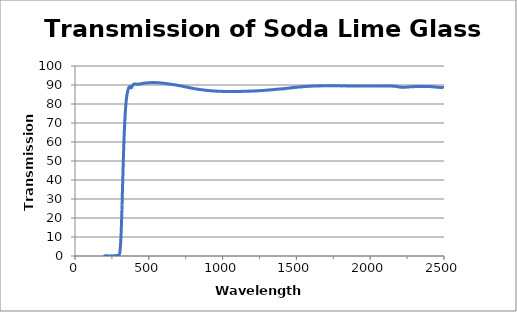
| Category | Wavelength (nm) |
|---|---|
| 2500.0 | 88.353 |
| 2499.0 | 88.603 |
| 2498.0 | 88.601 |
| 2497.0 | 88.594 |
| 2496.0 | 88.602 |
| 2495.0 | 88.6 |
| 2494.0 | 88.609 |
| 2493.0 | 88.615 |
| 2492.0 | 88.618 |
| 2491.0 | 88.608 |
| 2490.0 | 88.62 |
| 2489.0 | 88.626 |
| 2488.0 | 88.641 |
| 2487.0 | 88.64 |
| 2486.0 | 88.636 |
| 2485.0 | 88.64 |
| 2484.0 | 88.651 |
| 2483.0 | 88.662 |
| 2482.0 | 88.662 |
| 2481.0 | 88.669 |
| 2480.0 | 88.673 |
| 2479.0 | 88.682 |
| 2478.0 | 88.686 |
| 2477.0 | 88.693 |
| 2476.0 | 88.701 |
| 2475.0 | 88.702 |
| 2474.0 | 88.704 |
| 2473.0 | 88.718 |
| 2472.0 | 88.721 |
| 2471.0 | 88.729 |
| 2470.0 | 88.737 |
| 2469.0 | 88.743 |
| 2468.0 | 88.75 |
| 2467.0 | 88.754 |
| 2466.0 | 88.769 |
| 2465.0 | 88.775 |
| 2464.0 | 88.779 |
| 2463.0 | 88.773 |
| 2462.0 | 88.78 |
| 2461.0 | 88.8 |
| 2460.0 | 88.797 |
| 2459.0 | 88.797 |
| 2458.0 | 88.8 |
| 2457.0 | 88.791 |
| 2456.0 | 88.814 |
| 2455.0 | 88.825 |
| 2454.0 | 88.813 |
| 2453.0 | 88.838 |
| 2452.0 | 88.867 |
| 2451.0 | 88.877 |
| 2450.0 | 88.859 |
| 2449.0 | 88.879 |
| 2448.0 | 88.883 |
| 2447.0 | 88.892 |
| 2446.0 | 88.896 |
| 2445.0 | 88.91 |
| 2444.0 | 88.904 |
| 2443.0 | 88.913 |
| 2442.0 | 88.921 |
| 2441.0 | 88.931 |
| 2440.0 | 88.936 |
| 2439.0 | 88.947 |
| 2438.0 | 88.97 |
| 2437.0 | 88.963 |
| 2436.0 | 88.978 |
| 2435.0 | 88.982 |
| 2434.0 | 88.986 |
| 2433.0 | 88.985 |
| 2432.0 | 89.004 |
| 2431.0 | 89.008 |
| 2430.0 | 89.011 |
| 2429.0 | 89.038 |
| 2428.0 | 89.028 |
| 2427.0 | 89.035 |
| 2426.0 | 89.05 |
| 2425.0 | 89.043 |
| 2424.0 | 89.013 |
| 2423.0 | 89.048 |
| 2422.0 | 89.053 |
| 2421.0 | 89.077 |
| 2420.0 | 89.086 |
| 2419.0 | 89.094 |
| 2418.0 | 89.093 |
| 2417.0 | 89.095 |
| 2416.0 | 89.104 |
| 2415.0 | 89.088 |
| 2414.0 | 89.118 |
| 2413.0 | 89.128 |
| 2412.0 | 89.14 |
| 2411.0 | 89.134 |
| 2410.0 | 89.148 |
| 2409.0 | 89.146 |
| 2408.0 | 89.149 |
| 2407.0 | 89.152 |
| 2406.0 | 89.16 |
| 2405.0 | 89.162 |
| 2404.0 | 89.154 |
| 2403.0 | 89.161 |
| 2402.0 | 89.177 |
| 2401.0 | 89.176 |
| 2400.0 | 89.179 |
| 2399.0 | 89.194 |
| 2398.0 | 89.19 |
| 2397.0 | 89.213 |
| 2396.0 | 89.224 |
| 2395.0 | 89.224 |
| 2394.0 | 89.253 |
| 2393.0 | 89.227 |
| 2392.0 | 89.211 |
| 2391.0 | 89.215 |
| 2390.0 | 89.226 |
| 2389.0 | 89.229 |
| 2388.0 | 89.24 |
| 2387.0 | 89.234 |
| 2386.0 | 89.241 |
| 2385.0 | 89.243 |
| 2384.0 | 89.25 |
| 2383.0 | 89.22 |
| 2382.0 | 89.263 |
| 2381.0 | 89.226 |
| 2380.0 | 89.247 |
| 2379.0 | 89.234 |
| 2378.0 | 89.244 |
| 2377.0 | 89.249 |
| 2376.0 | 89.235 |
| 2375.0 | 89.22 |
| 2374.0 | 89.239 |
| 2373.0 | 89.218 |
| 2372.0 | 89.235 |
| 2371.0 | 89.245 |
| 2370.0 | 89.231 |
| 2369.0 | 89.263 |
| 2368.0 | 89.226 |
| 2367.0 | 89.25 |
| 2366.0 | 89.234 |
| 2365.0 | 89.248 |
| 2364.0 | 89.243 |
| 2363.0 | 89.235 |
| 2362.0 | 89.259 |
| 2361.0 | 89.272 |
| 2360.0 | 89.241 |
| 2359.0 | 89.242 |
| 2358.0 | 89.244 |
| 2357.0 | 89.256 |
| 2356.0 | 89.237 |
| 2355.0 | 89.262 |
| 2354.0 | 89.268 |
| 2353.0 | 89.271 |
| 2352.0 | 89.255 |
| 2351.0 | 89.258 |
| 2350.0 | 89.254 |
| 2349.0 | 89.256 |
| 2348.0 | 89.246 |
| 2347.0 | 89.253 |
| 2346.0 | 89.261 |
| 2345.0 | 89.259 |
| 2344.0 | 89.257 |
| 2343.0 | 89.254 |
| 2342.0 | 89.249 |
| 2341.0 | 89.251 |
| 2340.0 | 89.241 |
| 2339.0 | 89.249 |
| 2338.0 | 89.247 |
| 2337.0 | 89.254 |
| 2336.0 | 89.286 |
| 2335.0 | 89.292 |
| 2334.0 | 89.239 |
| 2333.0 | 89.226 |
| 2332.0 | 89.157 |
| 2331.0 | 89.278 |
| 2330.0 | 89.217 |
| 2329.0 | 89.229 |
| 2328.0 | 89.24 |
| 2327.0 | 89.231 |
| 2326.0 | 89.197 |
| 2325.0 | 89.227 |
| 2324.0 | 89.244 |
| 2323.0 | 89.221 |
| 2322.0 | 89.224 |
| 2321.0 | 89.211 |
| 2320.0 | 89.201 |
| 2319.0 | 89.211 |
| 2318.0 | 89.223 |
| 2317.0 | 89.2 |
| 2316.0 | 89.198 |
| 2315.0 | 89.193 |
| 2314.0 | 89.194 |
| 2313.0 | 89.202 |
| 2312.0 | 89.196 |
| 2311.0 | 89.198 |
| 2310.0 | 89.199 |
| 2309.0 | 89.205 |
| 2308.0 | 89.187 |
| 2307.0 | 89.181 |
| 2306.0 | 89.174 |
| 2305.0 | 89.179 |
| 2304.0 | 89.179 |
| 2303.0 | 89.176 |
| 2302.0 | 89.165 |
| 2301.0 | 89.162 |
| 2300.0 | 89.162 |
| 2299.0 | 89.15 |
| 2298.0 | 89.14 |
| 2297.0 | 89.154 |
| 2296.0 | 89.144 |
| 2295.0 | 89.141 |
| 2294.0 | 89.137 |
| 2293.0 | 89.14 |
| 2292.0 | 89.135 |
| 2291.0 | 89.122 |
| 2290.0 | 89.122 |
| 2289.0 | 89.106 |
| 2288.0 | 89.111 |
| 2287.0 | 89.104 |
| 2286.0 | 89.107 |
| 2285.0 | 89.102 |
| 2284.0 | 89.106 |
| 2283.0 | 89.091 |
| 2282.0 | 89.087 |
| 2281.0 | 89.078 |
| 2280.0 | 89.076 |
| 2279.0 | 89.073 |
| 2278.0 | 89.071 |
| 2277.0 | 89.066 |
| 2276.0 | 89.061 |
| 2275.0 | 89.056 |
| 2274.0 | 89.05 |
| 2273.0 | 89.04 |
| 2272.0 | 89.04 |
| 2271.0 | 89.03 |
| 2270.0 | 89.028 |
| 2269.0 | 89.025 |
| 2268.0 | 89.019 |
| 2267.0 | 89.014 |
| 2266.0 | 89.009 |
| 2265.0 | 89.002 |
| 2264.0 | 88.988 |
| 2263.0 | 88.985 |
| 2262.0 | 88.979 |
| 2261.0 | 88.97 |
| 2260.0 | 88.97 |
| 2259.0 | 88.968 |
| 2258.0 | 88.958 |
| 2257.0 | 88.962 |
| 2256.0 | 88.944 |
| 2255.0 | 88.939 |
| 2254.0 | 88.932 |
| 2253.0 | 88.931 |
| 2252.0 | 88.928 |
| 2251.0 | 88.92 |
| 2250.0 | 88.918 |
| 2249.0 | 88.913 |
| 2248.0 | 88.896 |
| 2247.0 | 88.886 |
| 2246.0 | 88.881 |
| 2245.0 | 88.879 |
| 2244.0 | 88.872 |
| 2243.0 | 88.875 |
| 2242.0 | 88.866 |
| 2241.0 | 88.86 |
| 2240.0 | 88.854 |
| 2239.0 | 88.839 |
| 2238.0 | 88.832 |
| 2237.0 | 88.843 |
| 2236.0 | 88.833 |
| 2235.0 | 88.826 |
| 2234.0 | 88.82 |
| 2233.0 | 88.824 |
| 2232.0 | 88.813 |
| 2231.0 | 88.808 |
| 2230.0 | 88.802 |
| 2229.0 | 88.798 |
| 2228.0 | 88.791 |
| 2227.0 | 88.801 |
| 2226.0 | 88.801 |
| 2225.0 | 88.817 |
| 2224.0 | 88.807 |
| 2223.0 | 88.799 |
| 2222.0 | 88.785 |
| 2221.0 | 88.784 |
| 2220.0 | 88.794 |
| 2219.0 | 88.801 |
| 2218.0 | 88.806 |
| 2217.0 | 88.809 |
| 2216.0 | 88.794 |
| 2215.0 | 88.785 |
| 2214.0 | 88.792 |
| 2213.0 | 88.806 |
| 2212.0 | 88.808 |
| 2211.0 | 88.825 |
| 2210.0 | 88.811 |
| 2209.0 | 88.832 |
| 2208.0 | 88.855 |
| 2207.0 | 88.889 |
| 2206.0 | 88.856 |
| 2205.0 | 88.888 |
| 2204.0 | 88.879 |
| 2203.0 | 88.886 |
| 2202.0 | 88.875 |
| 2201.0 | 88.897 |
| 2200.0 | 88.908 |
| 2199.0 | 88.934 |
| 2198.0 | 88.927 |
| 2197.0 | 88.939 |
| 2196.0 | 88.954 |
| 2195.0 | 88.963 |
| 2194.0 | 88.977 |
| 2193.0 | 88.991 |
| 2192.0 | 89.02 |
| 2191.0 | 89.026 |
| 2190.0 | 89.037 |
| 2189.0 | 89.046 |
| 2188.0 | 89.066 |
| 2187.0 | 89.037 |
| 2186.0 | 89.076 |
| 2185.0 | 89.076 |
| 2184.0 | 89.166 |
| 2183.0 | 89.151 |
| 2182.0 | 89.15 |
| 2181.0 | 89.193 |
| 2180.0 | 89.198 |
| 2179.0 | 89.211 |
| 2178.0 | 89.22 |
| 2177.0 | 89.204 |
| 2176.0 | 89.243 |
| 2175.0 | 89.265 |
| 2174.0 | 89.292 |
| 2173.0 | 89.296 |
| 2172.0 | 89.304 |
| 2171.0 | 89.304 |
| 2170.0 | 89.308 |
| 2169.0 | 89.321 |
| 2168.0 | 89.342 |
| 2167.0 | 89.353 |
| 2166.0 | 89.364 |
| 2165.0 | 89.366 |
| 2164.0 | 89.371 |
| 2163.0 | 89.383 |
| 2162.0 | 89.383 |
| 2161.0 | 89.38 |
| 2160.0 | 89.402 |
| 2159.0 | 89.396 |
| 2158.0 | 89.419 |
| 2157.0 | 89.402 |
| 2156.0 | 89.324 |
| 2155.0 | 89.509 |
| 2154.0 | 89.414 |
| 2153.0 | 89.369 |
| 2152.0 | 89.45 |
| 2151.0 | 89.47 |
| 2150.0 | 89.429 |
| 2149.0 | 89.469 |
| 2148.0 | 89.467 |
| 2147.0 | 89.447 |
| 2146.0 | 89.453 |
| 2145.0 | 89.471 |
| 2144.0 | 89.469 |
| 2143.0 | 89.459 |
| 2142.0 | 89.47 |
| 2141.0 | 89.465 |
| 2140.0 | 89.483 |
| 2139.0 | 89.497 |
| 2138.0 | 89.493 |
| 2137.0 | 89.502 |
| 2136.0 | 89.479 |
| 2135.0 | 89.478 |
| 2134.0 | 89.423 |
| 2133.0 | 89.572 |
| 2132.0 | 89.498 |
| 2131.0 | 89.478 |
| 2130.0 | 89.44 |
| 2129.0 | 89.53 |
| 2128.0 | 89.481 |
| 2127.0 | 89.475 |
| 2126.0 | 89.537 |
| 2125.0 | 89.517 |
| 2124.0 | 89.497 |
| 2123.0 | 89.515 |
| 2122.0 | 89.529 |
| 2121.0 | 89.503 |
| 2120.0 | 89.513 |
| 2119.0 | 89.516 |
| 2118.0 | 89.513 |
| 2117.0 | 89.532 |
| 2116.0 | 89.494 |
| 2115.0 | 89.526 |
| 2114.0 | 89.529 |
| 2113.0 | 89.562 |
| 2112.0 | 89.427 |
| 2111.0 | 89.51 |
| 2110.0 | 89.565 |
| 2109.0 | 89.537 |
| 2108.0 | 89.457 |
| 2107.0 | 89.563 |
| 2106.0 | 89.523 |
| 2105.0 | 89.498 |
| 2104.0 | 89.533 |
| 2103.0 | 89.519 |
| 2102.0 | 89.503 |
| 2101.0 | 89.526 |
| 2100.0 | 89.515 |
| 2099.0 | 89.507 |
| 2098.0 | 89.525 |
| 2097.0 | 89.519 |
| 2096.0 | 89.513 |
| 2095.0 | 89.51 |
| 2094.0 | 89.508 |
| 2093.0 | 89.535 |
| 2092.0 | 89.502 |
| 2091.0 | 89.528 |
| 2090.0 | 89.538 |
| 2089.0 | 89.517 |
| 2088.0 | 89.508 |
| 2087.0 | 89.521 |
| 2086.0 | 89.513 |
| 2085.0 | 89.503 |
| 2084.0 | 89.5 |
| 2083.0 | 89.542 |
| 2082.0 | 89.512 |
| 2081.0 | 89.524 |
| 2080.0 | 89.527 |
| 2079.0 | 89.518 |
| 2078.0 | 89.494 |
| 2077.0 | 89.505 |
| 2076.0 | 89.515 |
| 2075.0 | 89.501 |
| 2074.0 | 89.518 |
| 2073.0 | 89.516 |
| 2072.0 | 89.514 |
| 2071.0 | 89.527 |
| 2070.0 | 89.465 |
| 2069.0 | 89.509 |
| 2068.0 | 89.542 |
| 2067.0 | 89.48 |
| 2066.0 | 89.514 |
| 2065.0 | 89.479 |
| 2064.0 | 89.564 |
| 2063.0 | 89.506 |
| 2062.0 | 89.473 |
| 2061.0 | 89.531 |
| 2060.0 | 89.475 |
| 2059.0 | 89.487 |
| 2058.0 | 89.504 |
| 2057.0 | 89.5 |
| 2056.0 | 89.503 |
| 2055.0 | 89.488 |
| 2054.0 | 89.481 |
| 2053.0 | 89.499 |
| 2052.0 | 89.504 |
| 2051.0 | 89.498 |
| 2050.0 | 89.503 |
| 2049.0 | 89.506 |
| 2048.0 | 89.506 |
| 2047.0 | 89.488 |
| 2046.0 | 89.501 |
| 2045.0 | 89.509 |
| 2044.0 | 89.473 |
| 2043.0 | 89.479 |
| 2042.0 | 89.49 |
| 2041.0 | 89.496 |
| 2040.0 | 89.481 |
| 2039.0 | 89.503 |
| 2038.0 | 89.491 |
| 2037.0 | 89.461 |
| 2036.0 | 89.476 |
| 2035.0 | 89.481 |
| 2034.0 | 89.459 |
| 2033.0 | 89.492 |
| 2032.0 | 89.493 |
| 2031.0 | 89.469 |
| 2030.0 | 89.461 |
| 2029.0 | 89.477 |
| 2028.0 | 89.465 |
| 2027.0 | 89.489 |
| 2026.0 | 89.435 |
| 2025.0 | 89.482 |
| 2024.0 | 89.51 |
| 2023.0 | 89.418 |
| 2022.0 | 89.496 |
| 2021.0 | 89.532 |
| 2020.0 | 89.49 |
| 2019.0 | 89.408 |
| 2018.0 | 89.5 |
| 2017.0 | 89.489 |
| 2016.0 | 89.448 |
| 2015.0 | 89.495 |
| 2014.0 | 89.458 |
| 2013.0 | 89.448 |
| 2012.0 | 89.479 |
| 2011.0 | 89.455 |
| 2010.0 | 89.459 |
| 2009.0 | 89.476 |
| 2008.0 | 89.461 |
| 2007.0 | 89.451 |
| 2006.0 | 89.495 |
| 2005.0 | 89.472 |
| 2004.0 | 89.489 |
| 2003.0 | 89.468 |
| 2002.0 | 89.489 |
| 2001.0 | 89.418 |
| 2000.0 | 89.482 |
| 1999.0 | 89.458 |
| 1998.0 | 89.462 |
| 1997.0 | 89.468 |
| 1996.0 | 89.46 |
| 1995.0 | 89.469 |
| 1994.0 | 89.465 |
| 1993.0 | 89.463 |
| 1992.0 | 89.46 |
| 1991.0 | 89.466 |
| 1990.0 | 89.457 |
| 1989.0 | 89.467 |
| 1988.0 | 89.463 |
| 1987.0 | 89.463 |
| 1986.0 | 89.456 |
| 1985.0 | 89.477 |
| 1984.0 | 89.422 |
| 1983.0 | 89.47 |
| 1982.0 | 89.483 |
| 1981.0 | 89.424 |
| 1980.0 | 89.465 |
| 1979.0 | 89.457 |
| 1978.0 | 89.431 |
| 1977.0 | 89.485 |
| 1976.0 | 89.459 |
| 1975.0 | 89.444 |
| 1974.0 | 89.468 |
| 1973.0 | 89.462 |
| 1972.0 | 89.443 |
| 1971.0 | 89.466 |
| 1970.0 | 89.474 |
| 1969.0 | 89.471 |
| 1968.0 | 89.465 |
| 1967.0 | 89.488 |
| 1966.0 | 89.44 |
| 1965.0 | 89.448 |
| 1964.0 | 89.501 |
| 1963.0 | 89.42 |
| 1962.0 | 89.464 |
| 1961.0 | 89.45 |
| 1960.0 | 89.467 |
| 1959.0 | 89.463 |
| 1958.0 | 89.471 |
| 1957.0 | 89.489 |
| 1956.0 | 89.442 |
| 1955.0 | 89.455 |
| 1954.0 | 89.463 |
| 1953.0 | 89.47 |
| 1952.0 | 89.45 |
| 1951.0 | 89.456 |
| 1950.0 | 89.477 |
| 1949.0 | 89.452 |
| 1948.0 | 89.464 |
| 1947.0 | 89.467 |
| 1946.0 | 89.465 |
| 1945.0 | 89.465 |
| 1944.0 | 89.469 |
| 1943.0 | 89.464 |
| 1942.0 | 89.476 |
| 1941.0 | 89.47 |
| 1940.0 | 89.479 |
| 1939.0 | 89.46 |
| 1938.0 | 89.452 |
| 1937.0 | 89.45 |
| 1936.0 | 89.449 |
| 1935.0 | 89.438 |
| 1934.0 | 89.45 |
| 1933.0 | 89.444 |
| 1932.0 | 89.43 |
| 1931.0 | 89.434 |
| 1930.0 | 89.437 |
| 1929.0 | 89.438 |
| 1928.0 | 89.424 |
| 1927.0 | 89.45 |
| 1926.0 | 89.443 |
| 1925.0 | 89.454 |
| 1924.0 | 89.465 |
| 1923.0 | 89.374 |
| 1922.0 | 89.475 |
| 1921.0 | 89.422 |
| 1920.0 | 89.461 |
| 1919.0 | 89.494 |
| 1918.0 | 89.486 |
| 1917.0 | 89.502 |
| 1916.0 | 89.488 |
| 1915.0 | 89.479 |
| 1914.0 | 89.483 |
| 1913.0 | 89.487 |
| 1912.0 | 89.49 |
| 1911.0 | 89.492 |
| 1910.0 | 89.494 |
| 1909.0 | 89.484 |
| 1908.0 | 89.494 |
| 1907.0 | 89.498 |
| 1906.0 | 89.503 |
| 1905.0 | 89.528 |
| 1904.0 | 89.504 |
| 1903.0 | 89.506 |
| 1902.0 | 89.51 |
| 1901.0 | 89.503 |
| 1900.0 | 89.511 |
| 1899.0 | 89.532 |
| 1898.0 | 89.519 |
| 1897.0 | 89.498 |
| 1896.0 | 89.516 |
| 1895.0 | 89.512 |
| 1894.0 | 89.507 |
| 1893.0 | 89.541 |
| 1892.0 | 89.512 |
| 1891.0 | 89.521 |
| 1890.0 | 89.524 |
| 1889.0 | 89.517 |
| 1888.0 | 89.538 |
| 1887.0 | 89.495 |
| 1886.0 | 89.518 |
| 1885.0 | 89.509 |
| 1884.0 | 89.525 |
| 1883.0 | 89.513 |
| 1882.0 | 89.51 |
| 1881.0 | 89.502 |
| 1880.0 | 89.482 |
| 1879.0 | 89.476 |
| 1878.0 | 89.487 |
| 1877.0 | 89.493 |
| 1876.0 | 89.495 |
| 1875.0 | 89.483 |
| 1874.0 | 89.483 |
| 1873.0 | 89.471 |
| 1872.0 | 89.483 |
| 1871.0 | 89.472 |
| 1870.0 | 89.487 |
| 1869.0 | 89.49 |
| 1868.0 | 89.493 |
| 1867.0 | 89.496 |
| 1866.0 | 89.5 |
| 1865.0 | 89.512 |
| 1864.0 | 89.511 |
| 1863.0 | 89.503 |
| 1862.0 | 89.498 |
| 1861.0 | 89.522 |
| 1860.0 | 89.541 |
| 1859.0 | 89.538 |
| 1858.0 | 89.525 |
| 1857.0 | 89.514 |
| 1856.0 | 89.521 |
| 1855.0 | 89.504 |
| 1854.0 | 89.519 |
| 1853.0 | 89.505 |
| 1852.0 | 89.5 |
| 1851.0 | 89.498 |
| 1850.0 | 89.502 |
| 1849.0 | 89.499 |
| 1848.0 | 89.493 |
| 1847.0 | 89.482 |
| 1846.0 | 89.481 |
| 1845.0 | 89.49 |
| 1844.0 | 89.489 |
| 1843.0 | 89.495 |
| 1842.0 | 89.502 |
| 1841.0 | 89.569 |
| 1840.0 | 89.444 |
| 1839.0 | 89.489 |
| 1838.0 | 89.501 |
| 1837.0 | 89.501 |
| 1836.0 | 89.514 |
| 1835.0 | 89.515 |
| 1834.0 | 89.532 |
| 1833.0 | 89.511 |
| 1832.0 | 89.534 |
| 1831.0 | 89.537 |
| 1830.0 | 89.534 |
| 1829.0 | 89.542 |
| 1828.0 | 89.552 |
| 1827.0 | 89.559 |
| 1826.0 | 89.564 |
| 1825.0 | 89.56 |
| 1824.0 | 89.561 |
| 1823.0 | 89.579 |
| 1822.0 | 89.536 |
| 1821.0 | 89.54 |
| 1820.0 | 89.541 |
| 1819.0 | 89.538 |
| 1818.0 | 89.546 |
| 1817.0 | 89.553 |
| 1816.0 | 89.568 |
| 1815.0 | 89.53 |
| 1814.0 | 89.516 |
| 1813.0 | 89.528 |
| 1812.0 | 89.523 |
| 1811.0 | 89.523 |
| 1810.0 | 89.531 |
| 1809.0 | 89.537 |
| 1808.0 | 89.528 |
| 1807.0 | 89.536 |
| 1806.0 | 89.521 |
| 1805.0 | 89.53 |
| 1804.0 | 89.517 |
| 1803.0 | 89.559 |
| 1802.0 | 89.542 |
| 1801.0 | 89.562 |
| 1800.0 | 89.544 |
| 1799.0 | 89.558 |
| 1798.0 | 89.539 |
| 1797.0 | 89.54 |
| 1796.0 | 89.548 |
| 1795.0 | 89.524 |
| 1794.0 | 89.545 |
| 1793.0 | 89.557 |
| 1792.0 | 89.551 |
| 1791.0 | 89.571 |
| 1790.0 | 89.545 |
| 1789.0 | 89.544 |
| 1788.0 | 89.549 |
| 1787.0 | 89.542 |
| 1786.0 | 89.561 |
| 1785.0 | 89.568 |
| 1784.0 | 89.577 |
| 1783.0 | 89.568 |
| 1782.0 | 89.564 |
| 1781.0 | 89.554 |
| 1780.0 | 89.53 |
| 1779.0 | 89.56 |
| 1778.0 | 89.568 |
| 1777.0 | 89.544 |
| 1776.0 | 89.554 |
| 1775.0 | 89.539 |
| 1774.0 | 89.617 |
| 1773.0 | 89.565 |
| 1772.0 | 89.521 |
| 1771.0 | 89.597 |
| 1770.0 | 89.557 |
| 1769.0 | 89.572 |
| 1768.0 | 89.573 |
| 1767.0 | 89.6 |
| 1766.0 | 89.582 |
| 1765.0 | 89.568 |
| 1764.0 | 89.554 |
| 1763.0 | 89.582 |
| 1762.0 | 89.578 |
| 1761.0 | 89.568 |
| 1760.0 | 89.566 |
| 1759.0 | 89.584 |
| 1758.0 | 89.592 |
| 1757.0 | 89.59 |
| 1756.0 | 89.573 |
| 1755.0 | 89.574 |
| 1754.0 | 89.592 |
| 1753.0 | 89.608 |
| 1752.0 | 89.55 |
| 1751.0 | 89.585 |
| 1750.0 | 89.634 |
| 1749.0 | 89.581 |
| 1748.0 | 89.587 |
| 1747.0 | 89.569 |
| 1746.0 | 89.616 |
| 1745.0 | 89.576 |
| 1744.0 | 89.574 |
| 1743.0 | 89.617 |
| 1742.0 | 89.589 |
| 1741.0 | 89.574 |
| 1740.0 | 89.599 |
| 1739.0 | 89.589 |
| 1738.0 | 89.585 |
| 1737.0 | 89.586 |
| 1736.0 | 89.58 |
| 1735.0 | 89.588 |
| 1734.0 | 89.568 |
| 1733.0 | 89.624 |
| 1732.0 | 89.593 |
| 1731.0 | 89.597 |
| 1730.0 | 89.573 |
| 1729.0 | 89.596 |
| 1728.0 | 89.578 |
| 1727.0 | 89.594 |
| 1726.0 | 89.6 |
| 1725.0 | 89.609 |
| 1724.0 | 89.587 |
| 1723.0 | 89.588 |
| 1722.0 | 89.572 |
| 1721.0 | 89.559 |
| 1720.0 | 89.606 |
| 1719.0 | 89.582 |
| 1718.0 | 89.625 |
| 1717.0 | 89.534 |
| 1716.0 | 89.609 |
| 1715.0 | 89.641 |
| 1714.0 | 89.597 |
| 1713.0 | 89.546 |
| 1712.0 | 89.609 |
| 1711.0 | 89.578 |
| 1710.0 | 89.586 |
| 1709.0 | 89.619 |
| 1708.0 | 89.599 |
| 1707.0 | 89.584 |
| 1706.0 | 89.616 |
| 1705.0 | 89.586 |
| 1704.0 | 89.569 |
| 1703.0 | 89.597 |
| 1702.0 | 89.598 |
| 1701.0 | 89.594 |
| 1700.0 | 89.588 |
| 1699.0 | 89.604 |
| 1698.0 | 89.582 |
| 1697.0 | 89.588 |
| 1696.0 | 89.594 |
| 1695.0 | 89.603 |
| 1694.0 | 89.565 |
| 1693.0 | 89.579 |
| 1692.0 | 89.606 |
| 1691.0 | 89.604 |
| 1690.0 | 89.593 |
| 1689.0 | 89.613 |
| 1688.0 | 89.565 |
| 1687.0 | 89.569 |
| 1686.0 | 89.586 |
| 1685.0 | 89.608 |
| 1684.0 | 89.561 |
| 1683.0 | 89.61 |
| 1682.0 | 89.559 |
| 1681.0 | 89.573 |
| 1680.0 | 89.585 |
| 1679.0 | 89.579 |
| 1678.0 | 89.571 |
| 1677.0 | 89.563 |
| 1676.0 | 89.562 |
| 1675.0 | 89.588 |
| 1674.0 | 89.608 |
| 1673.0 | 89.555 |
| 1672.0 | 89.542 |
| 1671.0 | 89.587 |
| 1670.0 | 89.529 |
| 1669.0 | 89.551 |
| 1668.0 | 89.566 |
| 1667.0 | 89.554 |
| 1666.0 | 89.548 |
| 1665.0 | 89.565 |
| 1664.0 | 89.551 |
| 1663.0 | 89.533 |
| 1662.0 | 89.548 |
| 1661.0 | 89.528 |
| 1660.0 | 89.52 |
| 1659.0 | 89.556 |
| 1658.0 | 89.54 |
| 1657.0 | 89.539 |
| 1656.0 | 89.561 |
| 1655.0 | 89.547 |
| 1654.0 | 89.524 |
| 1653.0 | 89.528 |
| 1652.0 | 89.559 |
| 1651.0 | 89.498 |
| 1650.0 | 89.532 |
| 1649.0 | 89.555 |
| 1648.0 | 89.513 |
| 1647.0 | 89.522 |
| 1646.0 | 89.547 |
| 1645.0 | 89.476 |
| 1644.0 | 89.509 |
| 1643.0 | 89.531 |
| 1642.0 | 89.477 |
| 1641.0 | 89.498 |
| 1640.0 | 89.548 |
| 1639.0 | 89.482 |
| 1638.0 | 89.508 |
| 1637.0 | 89.52 |
| 1636.0 | 89.479 |
| 1635.0 | 89.476 |
| 1634.0 | 89.518 |
| 1633.0 | 89.525 |
| 1632.0 | 89.486 |
| 1631.0 | 89.485 |
| 1630.0 | 89.489 |
| 1629.0 | 89.464 |
| 1628.0 | 89.471 |
| 1627.0 | 89.494 |
| 1626.0 | 89.441 |
| 1625.0 | 89.474 |
| 1624.0 | 89.477 |
| 1623.0 | 89.497 |
| 1622.0 | 89.418 |
| 1621.0 | 89.462 |
| 1620.0 | 89.502 |
| 1619.0 | 89.451 |
| 1618.0 | 89.408 |
| 1617.0 | 89.448 |
| 1616.0 | 89.476 |
| 1615.0 | 89.408 |
| 1614.0 | 89.446 |
| 1613.0 | 89.447 |
| 1612.0 | 89.394 |
| 1611.0 | 89.419 |
| 1610.0 | 89.429 |
| 1609.0 | 89.416 |
| 1608.0 | 89.421 |
| 1607.0 | 89.416 |
| 1606.0 | 89.408 |
| 1605.0 | 89.418 |
| 1604.0 | 89.42 |
| 1603.0 | 89.392 |
| 1602.0 | 89.385 |
| 1601.0 | 89.377 |
| 1600.0 | 89.387 |
| 1599.0 | 89.411 |
| 1598.0 | 89.353 |
| 1597.0 | 89.382 |
| 1596.0 | 89.388 |
| 1595.0 | 89.32 |
| 1594.0 | 89.368 |
| 1593.0 | 89.362 |
| 1592.0 | 89.368 |
| 1591.0 | 89.294 |
| 1590.0 | 89.362 |
| 1589.0 | 89.375 |
| 1588.0 | 89.34 |
| 1587.0 | 89.295 |
| 1586.0 | 89.351 |
| 1585.0 | 89.334 |
| 1584.0 | 89.274 |
| 1583.0 | 89.318 |
| 1582.0 | 89.32 |
| 1581.0 | 89.289 |
| 1580.0 | 89.305 |
| 1579.0 | 89.309 |
| 1578.0 | 89.284 |
| 1577.0 | 89.279 |
| 1576.0 | 89.291 |
| 1575.0 | 89.286 |
| 1574.0 | 89.264 |
| 1573.0 | 89.267 |
| 1572.0 | 89.243 |
| 1571.0 | 89.263 |
| 1570.0 | 89.241 |
| 1569.0 | 89.238 |
| 1568.0 | 89.133 |
| 1567.0 | 89.206 |
| 1566.0 | 89.28 |
| 1565.0 | 89.245 |
| 1564.0 | 89.169 |
| 1563.0 | 89.256 |
| 1562.0 | 89.208 |
| 1561.0 | 89.212 |
| 1560.0 | 89.243 |
| 1559.0 | 89.154 |
| 1558.0 | 89.193 |
| 1557.0 | 89.203 |
| 1556.0 | 89.199 |
| 1555.0 | 89.162 |
| 1554.0 | 89.189 |
| 1553.0 | 89.176 |
| 1552.0 | 89.132 |
| 1551.0 | 89.154 |
| 1550.0 | 89.142 |
| 1549.0 | 89.149 |
| 1548.0 | 89.154 |
| 1547.0 | 89.145 |
| 1546.0 | 89.109 |
| 1545.0 | 89.117 |
| 1544.0 | 89.117 |
| 1543.0 | 89.116 |
| 1542.0 | 89.119 |
| 1541.0 | 89.058 |
| 1540.0 | 89.068 |
| 1539.0 | 89.099 |
| 1538.0 | 89.031 |
| 1537.0 | 89.054 |
| 1536.0 | 89.051 |
| 1535.0 | 89.102 |
| 1534.0 | 88.987 |
| 1533.0 | 89.042 |
| 1532.0 | 89.028 |
| 1531.0 | 89.103 |
| 1530.0 | 89.022 |
| 1529.0 | 88.954 |
| 1528.0 | 89.021 |
| 1527.0 | 89.006 |
| 1526.0 | 89.049 |
| 1525.0 | 88.932 |
| 1524.0 | 88.957 |
| 1523.0 | 88.979 |
| 1522.0 | 88.965 |
| 1521.0 | 88.951 |
| 1520.0 | 88.929 |
| 1519.0 | 88.936 |
| 1518.0 | 88.938 |
| 1517.0 | 88.94 |
| 1516.0 | 88.909 |
| 1515.0 | 88.905 |
| 1514.0 | 88.921 |
| 1513.0 | 88.891 |
| 1512.0 | 88.898 |
| 1511.0 | 88.885 |
| 1510.0 | 88.883 |
| 1509.0 | 88.865 |
| 1508.0 | 88.868 |
| 1507.0 | 88.869 |
| 1506.0 | 88.853 |
| 1505.0 | 88.851 |
| 1504.0 | 88.86 |
| 1503.0 | 88.846 |
| 1502.0 | 88.841 |
| 1501.0 | 88.826 |
| 1500.0 | 88.855 |
| 1499.0 | 88.795 |
| 1498.0 | 88.789 |
| 1497.0 | 88.735 |
| 1496.0 | 88.792 |
| 1495.0 | 88.764 |
| 1494.0 | 88.777 |
| 1493.0 | 88.764 |
| 1492.0 | 88.76 |
| 1491.0 | 88.697 |
| 1490.0 | 88.792 |
| 1489.0 | 88.725 |
| 1488.0 | 88.729 |
| 1487.0 | 88.715 |
| 1486.0 | 88.722 |
| 1485.0 | 88.662 |
| 1484.0 | 88.67 |
| 1483.0 | 88.674 |
| 1482.0 | 88.674 |
| 1481.0 | 88.658 |
| 1480.0 | 88.654 |
| 1479.0 | 88.658 |
| 1478.0 | 88.655 |
| 1477.0 | 88.571 |
| 1476.0 | 88.609 |
| 1475.0 | 88.619 |
| 1474.0 | 88.599 |
| 1473.0 | 88.591 |
| 1472.0 | 88.577 |
| 1471.0 | 88.581 |
| 1470.0 | 88.577 |
| 1469.0 | 88.571 |
| 1468.0 | 88.639 |
| 1467.0 | 88.524 |
| 1466.0 | 88.515 |
| 1465.0 | 88.475 |
| 1464.0 | 88.491 |
| 1463.0 | 88.525 |
| 1462.0 | 88.469 |
| 1461.0 | 88.492 |
| 1460.0 | 88.5 |
| 1459.0 | 88.491 |
| 1458.0 | 88.433 |
| 1457.0 | 88.454 |
| 1456.0 | 88.438 |
| 1455.0 | 88.435 |
| 1454.0 | 88.422 |
| 1453.0 | 88.415 |
| 1452.0 | 88.399 |
| 1451.0 | 88.398 |
| 1450.0 | 88.4 |
| 1449.0 | 88.372 |
| 1448.0 | 88.358 |
| 1447.0 | 88.34 |
| 1446.0 | 88.34 |
| 1445.0 | 88.346 |
| 1444.0 | 88.327 |
| 1443.0 | 88.333 |
| 1442.0 | 88.313 |
| 1441.0 | 88.308 |
| 1440.0 | 88.302 |
| 1439.0 | 88.28 |
| 1438.0 | 88.252 |
| 1437.0 | 88.254 |
| 1436.0 | 88.255 |
| 1435.0 | 88.253 |
| 1434.0 | 88.257 |
| 1433.0 | 88.214 |
| 1432.0 | 88.209 |
| 1431.0 | 88.217 |
| 1430.0 | 88.196 |
| 1429.0 | 88.206 |
| 1428.0 | 88.177 |
| 1427.0 | 88.176 |
| 1426.0 | 88.156 |
| 1425.0 | 88.149 |
| 1424.0 | 88.137 |
| 1423.0 | 87.996 |
| 1422.0 | 88.187 |
| 1421.0 | 88.101 |
| 1420.0 | 88.086 |
| 1419.0 | 88.093 |
| 1418.0 | 88.072 |
| 1417.0 | 88.08 |
| 1416.0 | 88.06 |
| 1415.0 | 88.062 |
| 1414.0 | 88.028 |
| 1413.0 | 88.006 |
| 1412.0 | 88.055 |
| 1411.0 | 88.015 |
| 1410.0 | 87.979 |
| 1409.0 | 87.995 |
| 1408.0 | 87.992 |
| 1407.0 | 87.949 |
| 1406.0 | 87.94 |
| 1405.0 | 87.903 |
| 1404.0 | 88.006 |
| 1403.0 | 87.964 |
| 1402.0 | 87.962 |
| 1401.0 | 87.96 |
| 1400.0 | 87.966 |
| 1399.0 | 87.971 |
| 1398.0 | 87.968 |
| 1397.0 | 87.971 |
| 1396.0 | 87.932 |
| 1395.0 | 87.978 |
| 1394.0 | 87.941 |
| 1393.0 | 87.945 |
| 1392.0 | 87.916 |
| 1391.0 | 87.918 |
| 1390.0 | 87.906 |
| 1389.0 | 87.892 |
| 1388.0 | 87.878 |
| 1387.0 | 87.851 |
| 1386.0 | 87.877 |
| 1385.0 | 87.851 |
| 1384.0 | 87.845 |
| 1383.0 | 87.843 |
| 1382.0 | 87.846 |
| 1381.0 | 87.844 |
| 1380.0 | 87.832 |
| 1379.0 | 87.842 |
| 1378.0 | 87.838 |
| 1377.0 | 87.829 |
| 1376.0 | 87.818 |
| 1375.0 | 87.814 |
| 1374.0 | 87.819 |
| 1373.0 | 87.816 |
| 1372.0 | 87.793 |
| 1371.0 | 87.787 |
| 1370.0 | 87.787 |
| 1369.0 | 87.774 |
| 1368.0 | 87.752 |
| 1367.0 | 87.77 |
| 1366.0 | 87.759 |
| 1365.0 | 87.753 |
| 1364.0 | 87.723 |
| 1363.0 | 87.702 |
| 1362.0 | 87.727 |
| 1361.0 | 87.701 |
| 1360.0 | 87.694 |
| 1359.0 | 87.693 |
| 1358.0 | 87.687 |
| 1357.0 | 87.687 |
| 1356.0 | 87.65 |
| 1355.0 | 87.663 |
| 1354.0 | 87.65 |
| 1353.0 | 87.651 |
| 1352.0 | 87.635 |
| 1351.0 | 87.643 |
| 1350.0 | 87.64 |
| 1349.0 | 87.632 |
| 1348.0 | 87.609 |
| 1347.0 | 87.599 |
| 1346.0 | 87.605 |
| 1345.0 | 87.591 |
| 1344.0 | 87.588 |
| 1343.0 | 87.549 |
| 1342.0 | 87.571 |
| 1341.0 | 87.524 |
| 1340.0 | 87.557 |
| 1339.0 | 87.498 |
| 1338.0 | 87.557 |
| 1337.0 | 87.565 |
| 1336.0 | 87.525 |
| 1335.0 | 87.515 |
| 1334.0 | 87.477 |
| 1333.0 | 87.505 |
| 1332.0 | 87.476 |
| 1331.0 | 87.486 |
| 1330.0 | 87.49 |
| 1329.0 | 87.472 |
| 1328.0 | 87.466 |
| 1327.0 | 87.458 |
| 1326.0 | 87.463 |
| 1325.0 | 87.449 |
| 1324.0 | 87.448 |
| 1323.0 | 87.435 |
| 1322.0 | 87.416 |
| 1321.0 | 87.413 |
| 1320.0 | 87.417 |
| 1319.0 | 87.396 |
| 1318.0 | 87.396 |
| 1317.0 | 87.393 |
| 1316.0 | 87.397 |
| 1315.0 | 87.307 |
| 1314.0 | 87.406 |
| 1313.0 | 87.445 |
| 1312.0 | 87.343 |
| 1311.0 | 87.351 |
| 1310.0 | 87.334 |
| 1309.0 | 87.339 |
| 1308.0 | 87.325 |
| 1307.0 | 87.327 |
| 1306.0 | 87.306 |
| 1305.0 | 87.321 |
| 1304.0 | 87.323 |
| 1303.0 | 87.29 |
| 1302.0 | 87.287 |
| 1301.0 | 87.281 |
| 1300.0 | 87.28 |
| 1299.0 | 87.281 |
| 1298.0 | 87.279 |
| 1297.0 | 87.26 |
| 1296.0 | 87.255 |
| 1295.0 | 87.258 |
| 1294.0 | 87.238 |
| 1293.0 | 87.261 |
| 1292.0 | 87.222 |
| 1291.0 | 87.21 |
| 1290.0 | 87.192 |
| 1289.0 | 87.229 |
| 1288.0 | 87.198 |
| 1287.0 | 87.199 |
| 1286.0 | 87.191 |
| 1285.0 | 87.189 |
| 1284.0 | 87.203 |
| 1283.0 | 87.189 |
| 1282.0 | 87.179 |
| 1281.0 | 87.158 |
| 1280.0 | 87.162 |
| 1279.0 | 87.149 |
| 1278.0 | 87.151 |
| 1277.0 | 87.132 |
| 1276.0 | 87.129 |
| 1275.0 | 87.114 |
| 1274.0 | 87.111 |
| 1273.0 | 87.113 |
| 1272.0 | 87.111 |
| 1271.0 | 87.094 |
| 1270.0 | 87.09 |
| 1269.0 | 87.099 |
| 1268.0 | 87.099 |
| 1267.0 | 87.094 |
| 1266.0 | 87.069 |
| 1265.0 | 87.087 |
| 1264.0 | 87.051 |
| 1263.0 | 87.062 |
| 1262.0 | 87.061 |
| 1261.0 | 87.038 |
| 1260.0 | 87.043 |
| 1259.0 | 87.038 |
| 1258.0 | 87.056 |
| 1257.0 | 87.008 |
| 1256.0 | 87.017 |
| 1255.0 | 87.012 |
| 1254.0 | 87.018 |
| 1253.0 | 87.017 |
| 1252.0 | 87.011 |
| 1251.0 | 87.005 |
| 1250.0 | 86.988 |
| 1249.0 | 86.981 |
| 1248.0 | 86.974 |
| 1247.0 | 86.969 |
| 1246.0 | 86.966 |
| 1245.0 | 86.97 |
| 1244.0 | 86.967 |
| 1243.0 | 86.963 |
| 1242.0 | 86.968 |
| 1241.0 | 86.957 |
| 1240.0 | 86.947 |
| 1239.0 | 86.943 |
| 1238.0 | 86.938 |
| 1237.0 | 86.941 |
| 1236.0 | 86.948 |
| 1235.0 | 86.938 |
| 1234.0 | 86.925 |
| 1233.0 | 86.938 |
| 1232.0 | 86.862 |
| 1231.0 | 86.905 |
| 1230.0 | 86.909 |
| 1229.0 | 86.895 |
| 1228.0 | 86.902 |
| 1227.0 | 86.905 |
| 1226.0 | 86.909 |
| 1225.0 | 86.948 |
| 1224.0 | 86.89 |
| 1223.0 | 86.871 |
| 1222.0 | 86.856 |
| 1221.0 | 86.847 |
| 1220.0 | 86.917 |
| 1219.0 | 86.878 |
| 1218.0 | 86.85 |
| 1217.0 | 86.834 |
| 1216.0 | 86.841 |
| 1215.0 | 86.873 |
| 1214.0 | 86.843 |
| 1213.0 | 86.819 |
| 1212.0 | 86.808 |
| 1211.0 | 86.836 |
| 1210.0 | 86.898 |
| 1209.0 | 86.814 |
| 1208.0 | 86.805 |
| 1207.0 | 86.814 |
| 1206.0 | 86.812 |
| 1205.0 | 86.808 |
| 1204.0 | 86.807 |
| 1203.0 | 86.811 |
| 1202.0 | 86.767 |
| 1201.0 | 86.801 |
| 1200.0 | 86.809 |
| 1199.0 | 86.804 |
| 1198.0 | 86.805 |
| 1197.0 | 86.783 |
| 1196.0 | 86.779 |
| 1195.0 | 86.777 |
| 1194.0 | 86.803 |
| 1193.0 | 86.758 |
| 1192.0 | 86.795 |
| 1191.0 | 86.789 |
| 1190.0 | 86.804 |
| 1189.0 | 86.809 |
| 1188.0 | 86.776 |
| 1187.0 | 86.768 |
| 1186.0 | 86.761 |
| 1185.0 | 86.751 |
| 1184.0 | 86.771 |
| 1183.0 | 86.748 |
| 1182.0 | 86.755 |
| 1181.0 | 86.761 |
| 1180.0 | 86.788 |
| 1179.0 | 86.724 |
| 1178.0 | 86.728 |
| 1177.0 | 86.736 |
| 1176.0 | 86.695 |
| 1175.0 | 86.726 |
| 1174.0 | 86.805 |
| 1173.0 | 86.73 |
| 1172.0 | 86.694 |
| 1171.0 | 86.711 |
| 1170.0 | 86.724 |
| 1169.0 | 86.751 |
| 1168.0 | 86.679 |
| 1167.0 | 86.693 |
| 1166.0 | 86.742 |
| 1165.0 | 86.692 |
| 1164.0 | 86.704 |
| 1163.0 | 86.718 |
| 1162.0 | 86.711 |
| 1161.0 | 86.727 |
| 1160.0 | 86.733 |
| 1159.0 | 86.7 |
| 1158.0 | 86.706 |
| 1157.0 | 86.747 |
| 1156.0 | 86.687 |
| 1155.0 | 86.676 |
| 1154.0 | 86.686 |
| 1153.0 | 86.702 |
| 1152.0 | 86.634 |
| 1151.0 | 86.676 |
| 1150.0 | 86.666 |
| 1149.0 | 86.669 |
| 1148.0 | 86.695 |
| 1147.0 | 86.649 |
| 1146.0 | 86.695 |
| 1145.0 | 86.683 |
| 1144.0 | 86.65 |
| 1143.0 | 86.653 |
| 1142.0 | 86.656 |
| 1141.0 | 86.668 |
| 1140.0 | 86.669 |
| 1139.0 | 86.698 |
| 1138.0 | 86.643 |
| 1137.0 | 86.671 |
| 1136.0 | 86.662 |
| 1135.0 | 86.616 |
| 1134.0 | 86.683 |
| 1133.0 | 86.616 |
| 1132.0 | 86.636 |
| 1131.0 | 86.679 |
| 1130.0 | 86.631 |
| 1129.0 | 86.632 |
| 1128.0 | 86.68 |
| 1127.0 | 86.602 |
| 1126.0 | 86.667 |
| 1125.0 | 86.614 |
| 1124.0 | 86.65 |
| 1123.0 | 86.642 |
| 1122.0 | 86.629 |
| 1121.0 | 86.638 |
| 1120.0 | 86.637 |
| 1119.0 | 86.674 |
| 1118.0 | 86.63 |
| 1117.0 | 86.614 |
| 1116.0 | 86.623 |
| 1115.0 | 86.644 |
| 1114.0 | 86.647 |
| 1113.0 | 86.626 |
| 1112.0 | 86.623 |
| 1111.0 | 86.622 |
| 1110.0 | 86.62 |
| 1109.0 | 86.632 |
| 1108.0 | 86.612 |
| 1107.0 | 86.617 |
| 1106.0 | 86.614 |
| 1105.0 | 86.616 |
| 1104.0 | 86.619 |
| 1103.0 | 86.623 |
| 1102.0 | 86.572 |
| 1101.0 | 86.597 |
| 1100.0 | 86.612 |
| 1099.0 | 86.6 |
| 1098.0 | 86.611 |
| 1097.0 | 86.601 |
| 1096.0 | 86.599 |
| 1095.0 | 86.619 |
| 1094.0 | 86.602 |
| 1093.0 | 86.63 |
| 1092.0 | 86.6 |
| 1091.0 | 86.602 |
| 1090.0 | 86.602 |
| 1089.0 | 86.609 |
| 1088.0 | 86.6 |
| 1087.0 | 86.605 |
| 1086.0 | 86.585 |
| 1085.0 | 86.575 |
| 1084.0 | 86.58 |
| 1083.0 | 86.599 |
| 1082.0 | 86.603 |
| 1081.0 | 86.586 |
| 1080.0 | 86.605 |
| 1079.0 | 86.597 |
| 1078.0 | 86.617 |
| 1077.0 | 86.601 |
| 1076.0 | 86.606 |
| 1075.0 | 86.587 |
| 1074.0 | 86.608 |
| 1073.0 | 86.596 |
| 1072.0 | 86.624 |
| 1071.0 | 86.611 |
| 1070.0 | 86.606 |
| 1069.0 | 86.605 |
| 1068.0 | 86.599 |
| 1067.0 | 86.603 |
| 1066.0 | 86.597 |
| 1065.0 | 86.588 |
| 1064.0 | 86.589 |
| 1063.0 | 86.606 |
| 1062.0 | 86.602 |
| 1061.0 | 86.596 |
| 1060.0 | 86.602 |
| 1059.0 | 86.602 |
| 1058.0 | 86.604 |
| 1057.0 | 86.604 |
| 1056.0 | 86.605 |
| 1055.0 | 86.6 |
| 1054.0 | 86.607 |
| 1053.0 | 86.603 |
| 1052.0 | 86.607 |
| 1051.0 | 86.618 |
| 1050.0 | 86.599 |
| 1049.0 | 86.59 |
| 1048.0 | 86.59 |
| 1047.0 | 86.585 |
| 1046.0 | 86.583 |
| 1045.0 | 86.588 |
| 1044.0 | 86.584 |
| 1043.0 | 86.586 |
| 1042.0 | 86.578 |
| 1041.0 | 86.579 |
| 1040.0 | 86.593 |
| 1039.0 | 86.59 |
| 1038.0 | 86.588 |
| 1037.0 | 86.569 |
| 1036.0 | 86.572 |
| 1035.0 | 86.578 |
| 1034.0 | 86.588 |
| 1033.0 | 86.589 |
| 1032.0 | 86.596 |
| 1031.0 | 86.578 |
| 1030.0 | 86.596 |
| 1029.0 | 86.602 |
| 1028.0 | 86.606 |
| 1027.0 | 86.6 |
| 1026.0 | 86.596 |
| 1025.0 | 86.59 |
| 1024.0 | 86.609 |
| 1023.0 | 86.605 |
| 1022.0 | 86.609 |
| 1021.0 | 86.601 |
| 1020.0 | 86.606 |
| 1019.0 | 86.599 |
| 1018.0 | 86.607 |
| 1017.0 | 86.599 |
| 1016.0 | 86.609 |
| 1015.0 | 86.594 |
| 1014.0 | 86.62 |
| 1013.0 | 86.61 |
| 1012.0 | 86.611 |
| 1011.0 | 86.602 |
| 1010.0 | 86.612 |
| 1009.0 | 86.613 |
| 1008.0 | 86.635 |
| 1007.0 | 86.627 |
| 1006.0 | 86.621 |
| 1005.0 | 86.625 |
| 1004.0 | 86.623 |
| 1003.0 | 86.639 |
| 1002.0 | 86.644 |
| 1001.0 | 86.641 |
| 1000.0 | 86.642 |
| 999.0 | 86.639 |
| 998.0 | 86.646 |
| 997.0 | 86.649 |
| 996.0 | 86.649 |
| 995.0 | 86.652 |
| 994.0 | 86.641 |
| 993.0 | 86.657 |
| 992.0 | 86.655 |
| 991.0 | 86.67 |
| 990.0 | 86.657 |
| 989.0 | 86.668 |
| 988.0 | 86.655 |
| 987.0 | 86.678 |
| 986.0 | 86.678 |
| 985.0 | 86.679 |
| 984.0 | 86.674 |
| 983.0 | 86.693 |
| 982.0 | 86.682 |
| 981.0 | 86.708 |
| 980.0 | 86.681 |
| 979.0 | 86.691 |
| 978.0 | 86.696 |
| 977.0 | 86.71 |
| 976.0 | 86.701 |
| 975.0 | 86.715 |
| 974.0 | 86.722 |
| 973.0 | 86.724 |
| 972.0 | 86.732 |
| 971.0 | 86.743 |
| 970.0 | 86.738 |
| 969.0 | 86.739 |
| 968.0 | 86.736 |
| 967.0 | 86.754 |
| 966.0 | 86.749 |
| 965.0 | 86.76 |
| 964.0 | 86.757 |
| 963.0 | 86.759 |
| 962.0 | 86.766 |
| 961.0 | 86.757 |
| 960.0 | 86.749 |
| 959.0 | 86.755 |
| 958.0 | 86.76 |
| 957.0 | 86.777 |
| 956.0 | 86.786 |
| 955.0 | 86.8 |
| 954.0 | 86.801 |
| 953.0 | 86.801 |
| 952.0 | 86.799 |
| 951.0 | 86.81 |
| 950.0 | 86.817 |
| 949.0 | 86.828 |
| 948.0 | 86.82 |
| 947.0 | 86.837 |
| 946.0 | 86.84 |
| 945.0 | 86.845 |
| 944.0 | 86.84 |
| 943.0 | 86.84 |
| 942.0 | 86.838 |
| 941.0 | 86.856 |
| 940.0 | 86.871 |
| 939.0 | 86.868 |
| 938.0 | 86.872 |
| 937.0 | 86.873 |
| 936.0 | 86.873 |
| 935.0 | 86.883 |
| 934.0 | 86.89 |
| 933.0 | 86.895 |
| 932.0 | 86.895 |
| 931.0 | 86.902 |
| 930.0 | 86.916 |
| 929.0 | 86.94 |
| 928.0 | 86.936 |
| 927.0 | 86.939 |
| 926.0 | 86.953 |
| 925.0 | 86.937 |
| 924.0 | 86.968 |
| 923.0 | 86.965 |
| 922.0 | 86.977 |
| 921.0 | 86.976 |
| 920.0 | 86.988 |
| 919.0 | 86.981 |
| 918.0 | 87.002 |
| 917.0 | 86.99 |
| 916.0 | 87.008 |
| 915.0 | 87.018 |
| 914.0 | 87.029 |
| 913.0 | 87.033 |
| 912.0 | 87.032 |
| 911.0 | 87.041 |
| 910.0 | 87.053 |
| 909.0 | 87.057 |
| 908.0 | 87.055 |
| 907.0 | 87.063 |
| 906.0 | 87.069 |
| 905.0 | 87.071 |
| 904.0 | 87.09 |
| 903.0 | 87.09 |
| 902.0 | 87.087 |
| 901.0 | 87.097 |
| 900.0 | 87.103 |
| 899.0 | 87.116 |
| 898.0 | 87.129 |
| 897.0 | 87.137 |
| 896.0 | 87.142 |
| 895.0 | 87.157 |
| 894.0 | 87.176 |
| 893.0 | 87.177 |
| 892.0 | 87.183 |
| 891.0 | 87.183 |
| 890.0 | 87.197 |
| 889.0 | 87.215 |
| 888.0 | 87.219 |
| 887.0 | 87.218 |
| 886.0 | 87.239 |
| 885.0 | 87.239 |
| 884.0 | 87.247 |
| 883.0 | 87.249 |
| 882.0 | 87.255 |
| 881.0 | 87.269 |
| 880.0 | 87.292 |
| 879.0 | 87.299 |
| 878.0 | 87.294 |
| 877.0 | 87.321 |
| 876.0 | 87.299 |
| 875.0 | 87.318 |
| 874.0 | 87.329 |
| 873.0 | 87.344 |
| 872.0 | 87.354 |
| 871.0 | 87.366 |
| 870.0 | 87.378 |
| 869.0 | 87.384 |
| 868.0 | 87.393 |
| 867.0 | 87.404 |
| 866.0 | 87.413 |
| 865.0 | 87.435 |
| 864.0 | 87.443 |
| 863.0 | 87.448 |
| 862.0 | 87.451 |
| 861.0 | 87.473 |
| 860.0 | 87.482 |
| 859.0 | 87.48 |
| 858.0 | 87.485 |
| 857.0 | 87.5 |
| 856.0 | 87.518 |
| 855.0 | 87.527 |
| 854.0 | 87.527 |
| 853.0 | 87.545 |
| 852.0 | 87.55 |
| 851.0 | 87.565 |
| 850.0 | 87.579 |
| 849.0 | 87.587 |
| 848.0 | 87.603 |
| 847.0 | 87.61 |
| 846.0 | 87.62 |
| 845.0 | 87.628 |
| 844.0 | 87.633 |
| 843.0 | 87.664 |
| 842.0 | 87.662 |
| 841.0 | 87.684 |
| 840.0 | 87.684 |
| 839.0 | 87.697 |
| 838.0 | 87.699 |
| 837.0 | 87.737 |
| 836.0 | 87.74 |
| 835.0 | 87.757 |
| 834.0 | 87.762 |
| 833.0 | 87.779 |
| 832.0 | 87.783 |
| 831.0 | 87.8 |
| 830.0 | 87.806 |
| 829.0 | 87.822 |
| 828.0 | 87.847 |
| 827.0 | 87.856 |
| 826.0 | 87.858 |
| 825.0 | 87.869 |
| 824.0 | 87.895 |
| 823.0 | 87.9 |
| 822.0 | 87.919 |
| 821.0 | 87.926 |
| 820.0 | 87.939 |
| 819.0 | 87.969 |
| 818.0 | 87.978 |
| 817.0 | 87.97 |
| 816.0 | 87.991 |
| 815.0 | 88.002 |
| 814.0 | 88.018 |
| 813.0 | 88.028 |
| 812.0 | 88.043 |
| 811.0 | 88.043 |
| 810.0 | 88.074 |
| 809.0 | 88.074 |
| 808.0 | 88.09 |
| 807.0 | 88.098 |
| 806.0 | 88.111 |
| 805.0 | 88.138 |
| 804.0 | 88.167 |
| 803.0 | 88.157 |
| 802.0 | 88.174 |
| 801.0 | 88.183 |
| 800.0 | 88.216 |
| 799.0 | 88.229 |
| 798.0 | 88.251 |
| 797.0 | 88.255 |
| 796.0 | 88.281 |
| 795.0 | 88.277 |
| 794.0 | 88.305 |
| 793.0 | 88.313 |
| 792.0 | 88.331 |
| 791.0 | 88.348 |
| 790.0 | 88.364 |
| 789.0 | 88.38 |
| 788.0 | 88.394 |
| 787.0 | 88.408 |
| 786.0 | 88.422 |
| 785.0 | 88.439 |
| 784.0 | 88.452 |
| 783.0 | 88.484 |
| 782.0 | 88.464 |
| 781.0 | 88.482 |
| 780.0 | 88.516 |
| 779.0 | 88.526 |
| 778.0 | 88.552 |
| 777.0 | 88.562 |
| 776.0 | 88.568 |
| 775.0 | 88.583 |
| 774.0 | 88.613 |
| 773.0 | 88.608 |
| 772.0 | 88.632 |
| 771.0 | 88.659 |
| 770.0 | 88.662 |
| 769.0 | 88.681 |
| 768.0 | 88.697 |
| 767.0 | 88.725 |
| 766.0 | 88.735 |
| 765.0 | 88.758 |
| 764.0 | 88.761 |
| 763.0 | 88.782 |
| 762.0 | 88.795 |
| 761.0 | 88.822 |
| 760.0 | 88.829 |
| 759.0 | 88.845 |
| 758.0 | 88.864 |
| 757.0 | 88.877 |
| 756.0 | 88.883 |
| 755.0 | 88.896 |
| 754.0 | 88.9 |
| 753.0 | 88.92 |
| 752.0 | 88.962 |
| 751.0 | 88.963 |
| 750.0 | 88.969 |
| 749.0 | 88.995 |
| 748.0 | 89 |
| 747.0 | 89.038 |
| 746.0 | 89.036 |
| 745.0 | 89.064 |
| 744.0 | 89.067 |
| 743.0 | 89.098 |
| 742.0 | 89.107 |
| 741.0 | 89.124 |
| 740.0 | 89.133 |
| 739.0 | 89.156 |
| 738.0 | 89.176 |
| 737.0 | 89.189 |
| 736.0 | 89.209 |
| 735.0 | 89.223 |
| 734.0 | 89.241 |
| 733.0 | 89.263 |
| 732.0 | 89.274 |
| 731.0 | 89.295 |
| 730.0 | 89.294 |
| 729.0 | 89.316 |
| 728.0 | 89.34 |
| 727.0 | 89.349 |
| 726.0 | 89.366 |
| 725.0 | 89.383 |
| 724.0 | 89.406 |
| 723.0 | 89.407 |
| 722.0 | 89.422 |
| 721.0 | 89.428 |
| 720.0 | 89.446 |
| 719.0 | 89.488 |
| 718.0 | 89.499 |
| 717.0 | 89.515 |
| 716.0 | 89.548 |
| 715.0 | 89.556 |
| 714.0 | 89.573 |
| 713.0 | 89.585 |
| 712.0 | 89.607 |
| 711.0 | 89.624 |
| 710.0 | 89.627 |
| 709.0 | 89.642 |
| 708.0 | 89.651 |
| 707.0 | 89.668 |
| 706.0 | 89.677 |
| 705.0 | 89.698 |
| 704.0 | 89.714 |
| 703.0 | 89.729 |
| 702.0 | 89.738 |
| 701.0 | 89.747 |
| 700.0 | 89.77 |
| 699.0 | 89.776 |
| 698.0 | 89.794 |
| 697.0 | 89.813 |
| 696.0 | 89.829 |
| 695.0 | 89.846 |
| 694.0 | 89.852 |
| 693.0 | 89.871 |
| 692.0 | 89.873 |
| 691.0 | 89.888 |
| 690.0 | 89.898 |
| 689.0 | 89.918 |
| 688.0 | 89.936 |
| 687.0 | 89.952 |
| 686.0 | 89.954 |
| 685.0 | 89.98 |
| 684.0 | 89.987 |
| 683.0 | 89.993 |
| 682.0 | 90.016 |
| 681.0 | 90.028 |
| 680.0 | 90.038 |
| 679.0 | 90.054 |
| 678.0 | 90.071 |
| 677.0 | 90.074 |
| 676.0 | 90.089 |
| 675.0 | 90.107 |
| 674.0 | 90.112 |
| 673.0 | 90.13 |
| 672.0 | 90.138 |
| 671.0 | 90.155 |
| 670.0 | 90.166 |
| 669.0 | 90.182 |
| 668.0 | 90.189 |
| 667.0 | 90.193 |
| 666.0 | 90.199 |
| 665.0 | 90.212 |
| 664.0 | 90.221 |
| 663.0 | 90.244 |
| 662.0 | 90.24 |
| 661.0 | 90.268 |
| 660.0 | 90.272 |
| 659.0 | 90.282 |
| 658.0 | 90.297 |
| 657.0 | 90.299 |
| 656.0 | 90.316 |
| 655.0 | 90.327 |
| 654.0 | 90.346 |
| 653.0 | 90.348 |
| 652.0 | 90.362 |
| 651.0 | 90.368 |
| 650.0 | 90.375 |
| 649.0 | 90.388 |
| 648.0 | 90.388 |
| 647.0 | 90.405 |
| 646.0 | 90.42 |
| 645.0 | 90.435 |
| 644.0 | 90.448 |
| 643.0 | 90.458 |
| 642.0 | 90.469 |
| 641.0 | 90.48 |
| 640.0 | 90.496 |
| 639.0 | 90.501 |
| 638.0 | 90.512 |
| 637.0 | 90.528 |
| 636.0 | 90.541 |
| 635.0 | 90.546 |
| 634.0 | 90.564 |
| 633.0 | 90.567 |
| 632.0 | 90.58 |
| 631.0 | 90.592 |
| 630.0 | 90.604 |
| 629.0 | 90.619 |
| 628.0 | 90.626 |
| 627.0 | 90.65 |
| 626.0 | 90.659 |
| 625.0 | 90.667 |
| 624.0 | 90.681 |
| 623.0 | 90.683 |
| 622.0 | 90.697 |
| 621.0 | 90.713 |
| 620.0 | 90.717 |
| 619.0 | 90.739 |
| 618.0 | 90.746 |
| 617.0 | 90.757 |
| 616.0 | 90.763 |
| 615.0 | 90.776 |
| 614.0 | 90.795 |
| 613.0 | 90.8 |
| 612.0 | 90.807 |
| 611.0 | 90.821 |
| 610.0 | 90.841 |
| 609.0 | 90.836 |
| 608.0 | 90.849 |
| 607.0 | 90.852 |
| 606.0 | 90.866 |
| 605.0 | 90.865 |
| 604.0 | 90.88 |
| 603.0 | 90.893 |
| 602.0 | 90.896 |
| 601.0 | 90.912 |
| 600.0 | 90.923 |
| 599.0 | 90.926 |
| 598.0 | 90.941 |
| 597.0 | 90.948 |
| 596.0 | 90.954 |
| 595.0 | 90.966 |
| 594.0 | 90.979 |
| 593.0 | 90.974 |
| 592.0 | 90.988 |
| 591.0 | 90.989 |
| 590.0 | 91.004 |
| 589.0 | 91.005 |
| 588.0 | 91.008 |
| 587.0 | 91.02 |
| 586.0 | 91.033 |
| 585.0 | 91.039 |
| 584.0 | 91.047 |
| 583.0 | 91.057 |
| 582.0 | 91.061 |
| 581.0 | 91.077 |
| 580.0 | 91.08 |
| 579.0 | 91.095 |
| 578.0 | 91.097 |
| 577.0 | 91.115 |
| 576.0 | 91.122 |
| 575.0 | 91.118 |
| 574.0 | 91.126 |
| 573.0 | 91.132 |
| 572.0 | 91.145 |
| 571.0 | 91.148 |
| 570.0 | 91.137 |
| 569.0 | 91.158 |
| 568.0 | 91.156 |
| 567.0 | 91.166 |
| 566.0 | 91.178 |
| 565.0 | 91.188 |
| 564.0 | 91.197 |
| 563.0 | 91.186 |
| 562.0 | 91.202 |
| 561.0 | 91.201 |
| 560.0 | 91.218 |
| 559.0 | 91.215 |
| 558.0 | 91.219 |
| 557.0 | 91.221 |
| 556.0 | 91.221 |
| 555.0 | 91.226 |
| 554.0 | 91.226 |
| 553.0 | 91.232 |
| 552.0 | 91.232 |
| 551.0 | 91.225 |
| 550.0 | 91.24 |
| 549.0 | 91.243 |
| 548.0 | 91.239 |
| 547.0 | 91.247 |
| 546.0 | 91.246 |
| 545.0 | 91.251 |
| 544.0 | 91.244 |
| 543.0 | 91.261 |
| 542.0 | 91.251 |
| 541.0 | 91.265 |
| 540.0 | 91.252 |
| 539.0 | 91.247 |
| 538.0 | 91.254 |
| 537.0 | 91.265 |
| 536.0 | 91.246 |
| 535.0 | 91.262 |
| 534.0 | 91.268 |
| 533.0 | 91.25 |
| 532.0 | 91.254 |
| 531.0 | 91.255 |
| 530.0 | 91.262 |
| 529.0 | 91.258 |
| 528.0 | 91.256 |
| 527.0 | 91.251 |
| 526.0 | 91.266 |
| 525.0 | 91.267 |
| 524.0 | 91.251 |
| 523.0 | 91.252 |
| 522.0 | 91.246 |
| 521.0 | 91.249 |
| 520.0 | 91.262 |
| 519.0 | 91.256 |
| 518.0 | 91.259 |
| 517.0 | 91.269 |
| 516.0 | 91.254 |
| 515.0 | 91.251 |
| 514.0 | 91.245 |
| 513.0 | 91.255 |
| 512.0 | 91.242 |
| 511.0 | 91.246 |
| 510.0 | 91.233 |
| 509.0 | 91.225 |
| 508.0 | 91.221 |
| 507.0 | 91.222 |
| 506.0 | 91.223 |
| 505.0 | 91.212 |
| 504.0 | 91.212 |
| 503.0 | 91.213 |
| 502.0 | 91.206 |
| 501.0 | 91.213 |
| 500.0 | 91.199 |
| 499.0 | 91.194 |
| 498.0 | 91.173 |
| 497.0 | 91.173 |
| 496.0 | 91.157 |
| 495.0 | 91.153 |
| 494.0 | 91.16 |
| 493.0 | 91.157 |
| 492.0 | 91.143 |
| 491.0 | 91.131 |
| 490.0 | 91.131 |
| 489.0 | 91.126 |
| 488.0 | 91.113 |
| 487.0 | 91.094 |
| 486.0 | 91.118 |
| 485.0 | 91.115 |
| 484.0 | 91.094 |
| 483.0 | 91.079 |
| 482.0 | 91.087 |
| 481.0 | 91.076 |
| 480.0 | 91.06 |
| 479.0 | 91.06 |
| 478.0 | 91.059 |
| 477.0 | 91.035 |
| 476.0 | 91.043 |
| 475.0 | 91.035 |
| 474.0 | 91.034 |
| 473.0 | 91.016 |
| 472.0 | 91.004 |
| 471.0 | 91.006 |
| 470.0 | 90.975 |
| 469.0 | 90.967 |
| 468.0 | 90.959 |
| 467.0 | 90.954 |
| 466.0 | 90.958 |
| 465.0 | 90.919 |
| 464.0 | 90.922 |
| 463.0 | 90.896 |
| 462.0 | 90.878 |
| 461.0 | 90.866 |
| 460.0 | 90.868 |
| 459.0 | 90.856 |
| 458.0 | 90.836 |
| 457.0 | 90.798 |
| 456.0 | 90.8 |
| 455.0 | 90.747 |
| 454.0 | 90.745 |
| 453.0 | 90.721 |
| 452.0 | 90.694 |
| 451.0 | 90.687 |
| 450.0 | 90.665 |
| 449.0 | 90.633 |
| 448.0 | 90.587 |
| 447.0 | 90.585 |
| 446.0 | 90.573 |
| 445.0 | 90.558 |
| 444.0 | 90.524 |
| 443.0 | 90.517 |
| 442.0 | 90.505 |
| 441.0 | 90.511 |
| 440.0 | 90.484 |
| 439.0 | 90.464 |
| 438.0 | 90.492 |
| 437.0 | 90.474 |
| 436.0 | 90.454 |
| 435.0 | 90.478 |
| 434.0 | 90.483 |
| 433.0 | 90.451 |
| 432.0 | 90.446 |
| 431.0 | 90.466 |
| 430.0 | 90.485 |
| 429.0 | 90.448 |
| 428.0 | 90.447 |
| 427.0 | 90.462 |
| 426.0 | 90.489 |
| 425.0 | 90.434 |
| 424.0 | 90.437 |
| 423.0 | 90.45 |
| 422.0 | 90.411 |
| 421.0 | 90.41 |
| 420.0 | 90.414 |
| 419.0 | 90.397 |
| 418.0 | 90.463 |
| 417.0 | 90.424 |
| 416.0 | 90.427 |
| 415.0 | 90.457 |
| 414.0 | 90.452 |
| 413.0 | 90.486 |
| 412.0 | 90.452 |
| 411.0 | 90.492 |
| 410.0 | 90.516 |
| 409.0 | 90.514 |
| 408.0 | 90.52 |
| 407.0 | 90.557 |
| 406.0 | 90.578 |
| 405.0 | 90.532 |
| 404.0 | 90.502 |
| 403.0 | 90.519 |
| 402.0 | 90.531 |
| 401.0 | 90.514 |
| 400.0 | 90.462 |
| 399.0 | 90.455 |
| 398.0 | 90.354 |
| 397.0 | 90.378 |
| 396.0 | 90.317 |
| 395.0 | 90.316 |
| 394.0 | 90.141 |
| 393.0 | 90.046 |
| 392.0 | 90.052 |
| 391.0 | 89.885 |
| 390.0 | 89.768 |
| 389.0 | 89.643 |
| 388.0 | 89.506 |
| 387.0 | 89.303 |
| 386.0 | 89.236 |
| 385.0 | 89.032 |
| 384.0 | 88.781 |
| 383.0 | 88.683 |
| 382.0 | 88.573 |
| 381.0 | 88.52 |
| 380.0 | 88.522 |
| 379.0 | 88.624 |
| 378.0 | 88.636 |
| 377.0 | 88.661 |
| 376.0 | 88.769 |
| 375.0 | 88.804 |
| 374.0 | 88.924 |
| 373.0 | 88.922 |
| 372.0 | 89.188 |
| 371.0 | 89.026 |
| 370.0 | 89.089 |
| 369.0 | 89.037 |
| 368.0 | 88.9 |
| 367.0 | 88.749 |
| 366.0 | 88.725 |
| 365.0 | 88.674 |
| 364.0 | 88.438 |
| 363.0 | 88.429 |
| 362.0 | 88.172 |
| 361.0 | 87.939 |
| 360.0 | 87.654 |
| 359.0 | 87.418 |
| 358.0 | 87.074 |
| 357.0 | 86.871 |
| 356.0 | 86.518 |
| 355.0 | 85.997 |
| 354.0 | 85.816 |
| 353.0 | 85.269 |
| 352.0 | 84.723 |
| 351.0 | 84.459 |
| 350.0 | 83.777 |
| 349.0 | 83.151 |
| 348.0 | 82.42 |
| 347.0 | 81.774 |
| 346.0 | 80.803 |
| 345.0 | 80.097 |
| 344.0 | 79.049 |
| 343.0 | 78.054 |
| 342.0 | 76.929 |
| 341.0 | 75.965 |
| 340.0 | 74.612 |
| 339.0 | 73.26 |
| 338.0 | 71.742 |
| 337.0 | 70.382 |
| 336.0 | 68.521 |
| 335.0 | 67.107 |
| 334.0 | 65.224 |
| 333.0 | 63.18 |
| 332.0 | 61.02 |
| 331.0 | 58.779 |
| 330.0 | 56.627 |
| 329.0 | 54.184 |
| 328.0 | 51.957 |
| 327.0 | 49.327 |
| 326.0 | 46.631 |
| 325.0 | 44.121 |
| 324.0 | 41.245 |
| 323.0 | 38.568 |
| 322.0 | 35.755 |
| 321.0 | 33.219 |
| 320.0 | 30.398 |
| 319.0 | 27.028 |
| 318.0 | 24.65 |
| 317.0 | 21.967 |
| 316.0 | 19.636 |
| 315.0 | 17.046 |
| 314.0 | 15.027 |
| 313.0 | 12.971 |
| 312.0 | 10.995 |
| 311.0 | 9.365 |
| 310.0 | 7.932 |
| 309.0 | 6.533 |
| 308.0 | 5.337 |
| 307.0 | 4.247 |
| 306.0 | 3.591 |
| 305.0 | 2.812 |
| 304.0 | 1.919 |
| 303.0 | 1.556 |
| 302.0 | 1.298 |
| 301.0 | 1.034 |
| 300.0 | 0.786 |
| 299.0 | 0.525 |
| 298.0 | 0.394 |
| 297.0 | 0.241 |
| 296.0 | 0.361 |
| 295.0 | 0.14 |
| 294.0 | 0.096 |
| 293.0 | 0.074 |
| 292.0 | 0.161 |
| 291.0 | 0.182 |
| 290.0 | 0.047 |
| 289.0 | 0.154 |
| 288.0 | -0.071 |
| 287.0 | 0.235 |
| 286.0 | 0.196 |
| 285.0 | 0.148 |
| 284.0 | 0.017 |
| 283.0 | 0.082 |
| 282.0 | 0.075 |
| 281.0 | 0.072 |
| 280.0 | 0.296 |
| 279.0 | 0.031 |
| 278.0 | 0.067 |
| 277.0 | 0.053 |
| 276.0 | 0.134 |
| 275.0 | 0.064 |
| 274.0 | 0.195 |
| 273.0 | 0.079 |
| 272.0 | 0.109 |
| 271.0 | 0.133 |
| 270.0 | 0.192 |
| 269.0 | 0.015 |
| 268.0 | -0.089 |
| 267.0 | 0.018 |
| 266.0 | 0.097 |
| 265.0 | -0.034 |
| 264.0 | 0.046 |
| 263.0 | 0.079 |
| 262.0 | 0.03 |
| 261.0 | 0.051 |
| 260.0 | 0.023 |
| 259.0 | 0.027 |
| 258.0 | 0.021 |
| 257.0 | 0.089 |
| 256.0 | 0.025 |
| 255.0 | 0.026 |
| 254.0 | 0.023 |
| 253.0 | 0.032 |
| 252.0 | -0.019 |
| 251.0 | 0.039 |
| 250.0 | 0.073 |
| 249.0 | 0.025 |
| 248.0 | 0.064 |
| 247.0 | 0 |
| 246.0 | -0.022 |
| 245.0 | 0.056 |
| 244.0 | 0.001 |
| 243.0 | -0.005 |
| 242.0 | 0.069 |
| 241.0 | 0.042 |
| 240.0 | 0.024 |
| 239.0 | 0.04 |
| 238.0 | -0.024 |
| 237.0 | 0.043 |
| 236.0 | 0.052 |
| 235.0 | 0.009 |
| 234.0 | 0.009 |
| 233.0 | 0.018 |
| 232.0 | -0.014 |
| 231.0 | 0.04 |
| 230.0 | 0.011 |
| 229.0 | 0.02 |
| 228.0 | 0.021 |
| 227.0 | 0.053 |
| 226.0 | 0.022 |
| 225.0 | 0.039 |
| 224.0 | 0.061 |
| 223.0 | 0.006 |
| 222.0 | 0.073 |
| 221.0 | 0.057 |
| 220.0 | 0.034 |
| 219.0 | 0.06 |
| 218.0 | 0.052 |
| 217.0 | 0.125 |
| 216.0 | 0.093 |
| 215.0 | 0.003 |
| 214.0 | 0.171 |
| 213.0 | 0.062 |
| 212.0 | 0.136 |
| 211.0 | 0.064 |
| 210.0 | 0.16 |
| 209.0 | 0.139 |
| 208.0 | 0.135 |
| 207.0 | 0.116 |
| 206.0 | 0.136 |
| 205.0 | 0.076 |
| 204.0 | 0.208 |
| 203.0 | 0.016 |
| 202.0 | -0.086 |
| 201.0 | 0.108 |
| 200.0 | 0.518 |